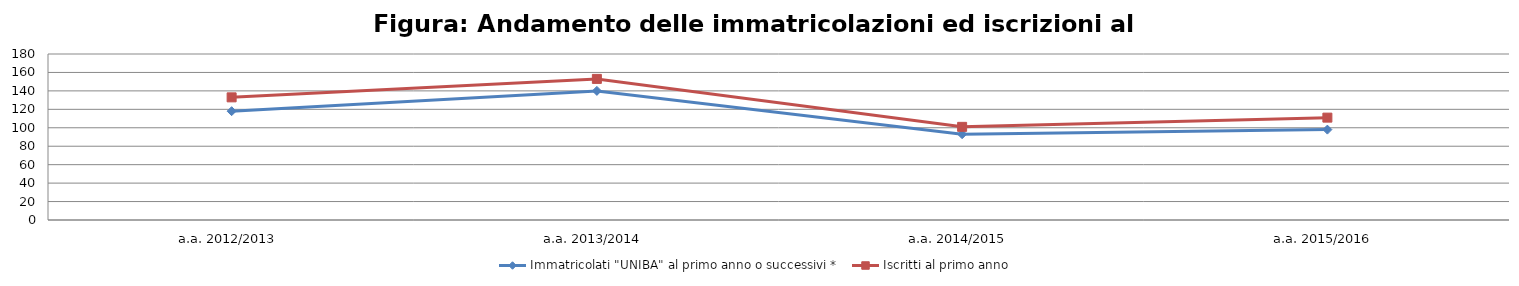
| Category | Immatricolati "UNIBA" al primo anno o successivi * | Iscritti al primo anno  |
|---|---|---|
| a.a. 2012/2013 | 118 | 133 |
| a.a. 2013/2014 | 140 | 153 |
| a.a. 2014/2015 | 93 | 101 |
| a.a. 2015/2016 | 98 | 111 |